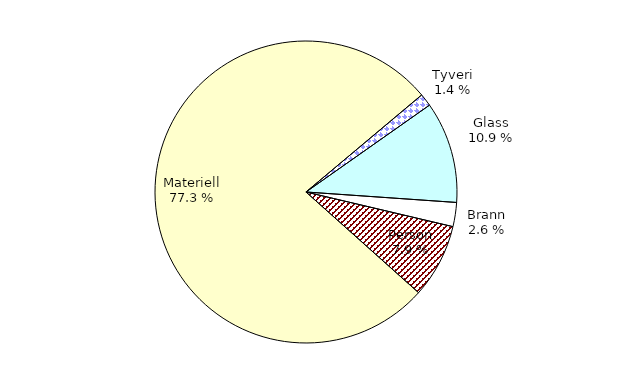
| Category | Series 0 |
|---|---|
| Tyveri | 210.11 |
| Glass | 1683.753 |
| Brann | 400.108 |
| Person | 1228.904 |
| Materiell | 11979.564 |